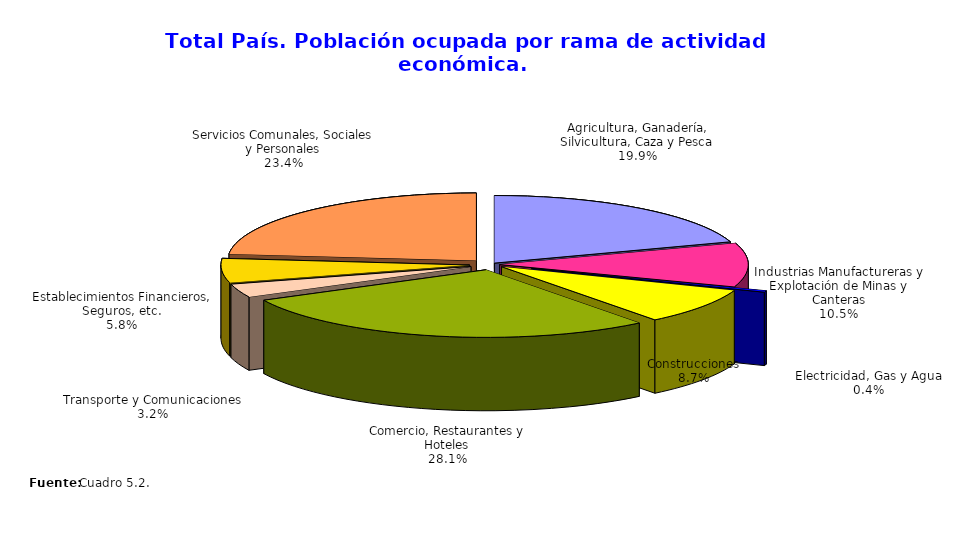
| Category | Series 0 |
|---|---|
| Agricultura, Ganadería, Silvicultura, Caza y Pesca | 703721 |
| Industrias Manufactureras y Explotación de Minas y Canteras | 370556 |
| Electricidad, Gas y Agua | 12640 |
| Construcciones | 307553 |
| Comercio, Restaurantes y Hoteles | 995713 |
| Transporte y Comunicaciones | 113919 |
| Establecimientos Financieros, Seguros, etc. | 204938 |
| Servicios Comunales, Sociales y Personales | 828460 |